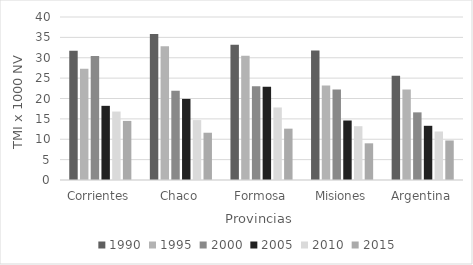
| Category | 1990 | 1995 | 2000 | 2005 | 2010 | 2015 |
|---|---|---|---|---|---|---|
| Corrientes | 31.7 | 27.3 | 30.4 | 18.2 | 16.8 | 14.5 |
| Chaco | 35.8 | 32.8 | 21.9 | 19.9 | 14.7 | 11.6 |
| Formosa | 33.2 | 30.5 | 23 | 22.9 | 17.8 | 12.6 |
| Misiones | 31.8 | 23.2 | 22.2 | 14.6 | 13.2 | 9 |
| Argentina | 25.6 | 22.2 | 16.6 | 13.3 | 11.9 | 9.7 |